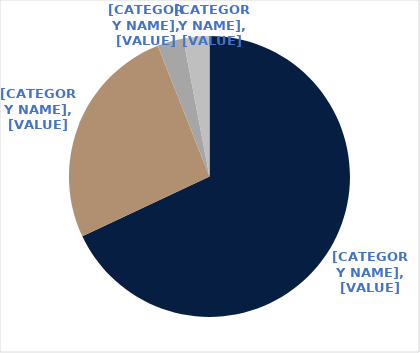
| Category | Series 0 |
|---|---|
| NSW | 0.68 |
| QLD | 0.26 |
| VIC | 0.03 |
| ACT | 0.03 |